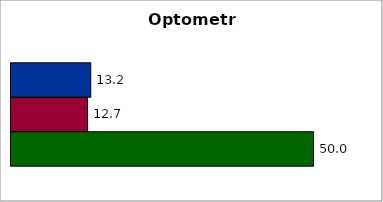
| Category | 50 states and D.C. | SREB states | State |
|---|---|---|---|
| 0 | 13.184 | 12.658 | 50 |